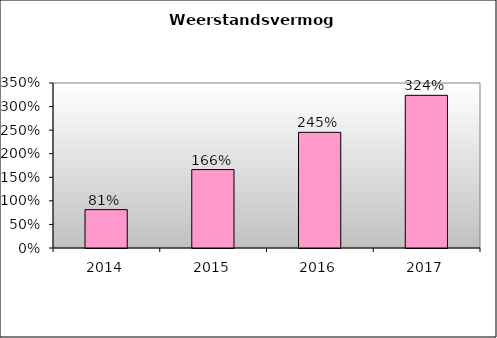
| Category | Series 0 |
|---|---|
| 2014.0 | 0.814 |
| 2015.0 | 1.663 |
| 2016.0 | 2.454 |
| 2017.0 | 3.239 |